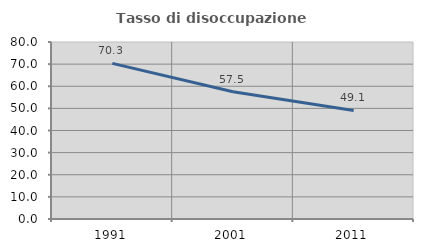
| Category | Tasso di disoccupazione giovanile  |
|---|---|
| 1991.0 | 70.331 |
| 2001.0 | 57.51 |
| 2011.0 | 49.085 |